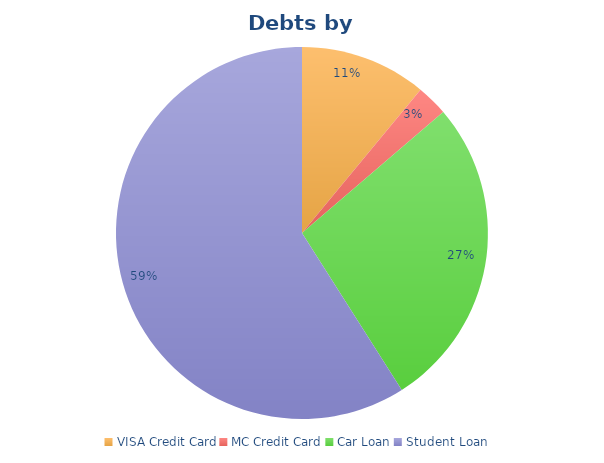
| Category | Series 0 |
|---|---|
| VISA Credit Card | 3225.34 |
| MC Credit Card | 800 |
| Car Loan | 8000 |
| Student Loan | 17312 |